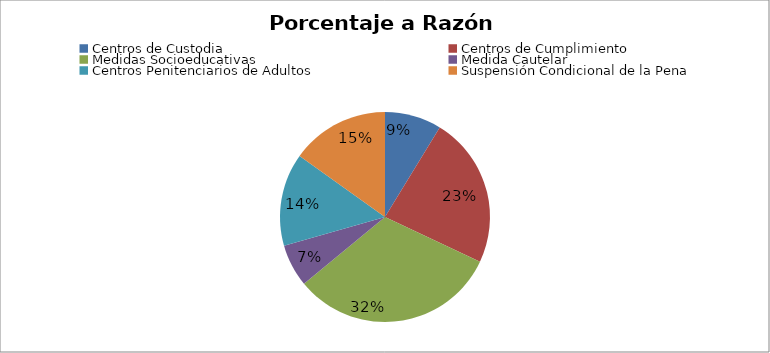
| Category | Series 0 |
|---|---|
| Centros de Custodia | 108 |
| Centros de Cumplimiento | 288 |
| Medidas Socioeducativas | 396 |
| Medida Cautelar | 81 |
| Centros Penitenciarios de Adultos | 177 |
| Suspensión Condicional de la Pena | 187 |